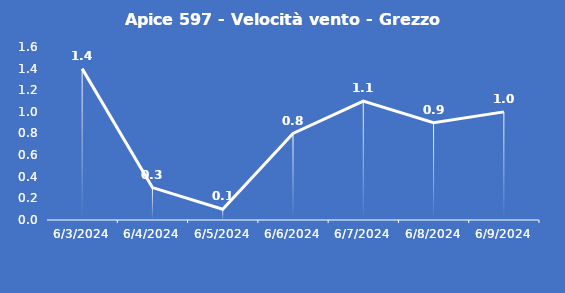
| Category | Apice 597 - Velocità vento - Grezzo (m/s) |
|---|---|
| 6/3/24 | 1.4 |
| 6/4/24 | 0.3 |
| 6/5/24 | 0.1 |
| 6/6/24 | 0.8 |
| 6/7/24 | 1.1 |
| 6/8/24 | 0.9 |
| 6/9/24 | 1 |